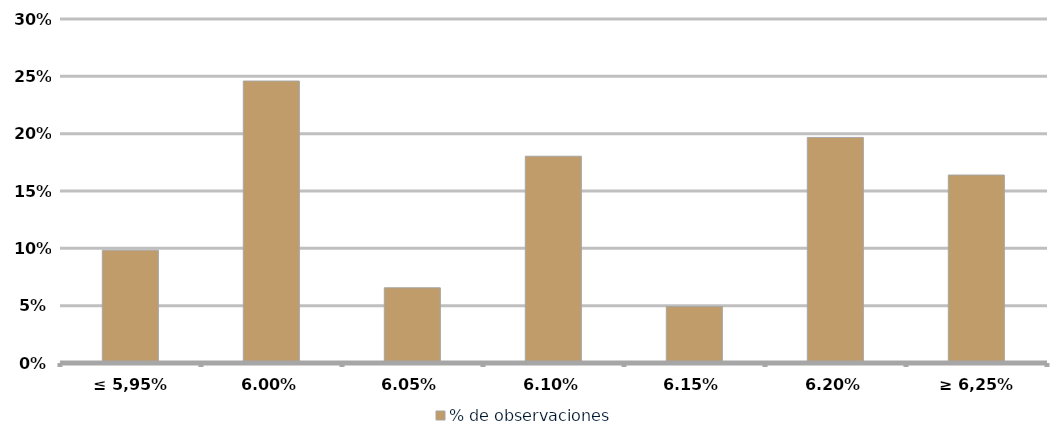
| Category | % de observaciones  |
|---|---|
| ≤ 5,95% | 0.098 |
| 6,00% | 0.246 |
| 6,05% | 0.066 |
| 6,10% | 0.18 |
| 6,15% | 0.049 |
| 6,20% | 0.197 |
| ≥ 6,25% | 0.164 |